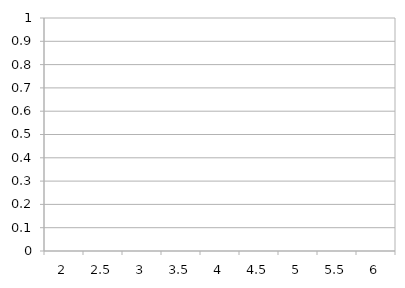
| Category | Series 0 |
|---|---|
| 2 | 0 |
| 2.5 | 0 |
| 3 | 0 |
| 3.5 | 0 |
| 4 | 0 |
| 4.5 | 0 |
| 5 | 0 |
| 5.5 | 0 |
| 6 | 0 |